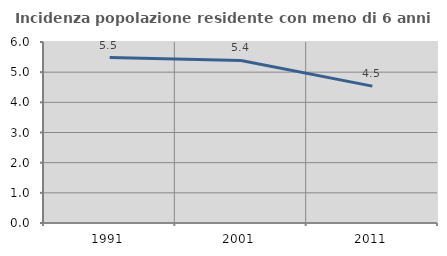
| Category | Incidenza popolazione residente con meno di 6 anni |
|---|---|
| 1991.0 | 5.485 |
| 2001.0 | 5.389 |
| 2011.0 | 4.537 |